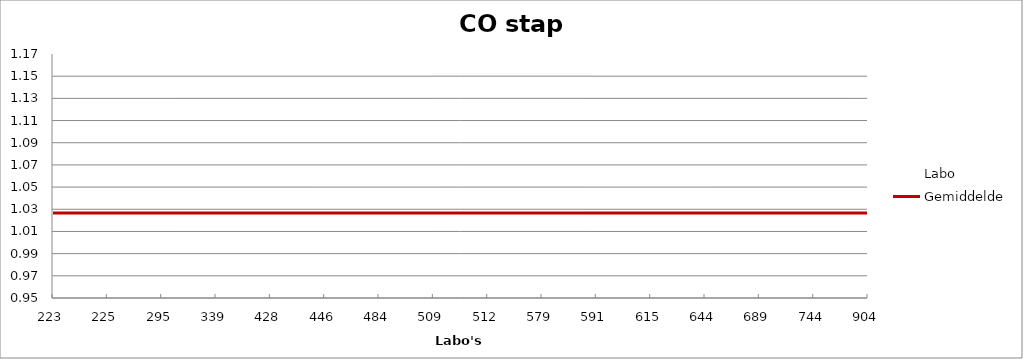
| Category | Labo | Gemiddelde |
|---|---|---|
| 223.0 | 1.004 | 1.027 |
| 225.0 | 0.973 | 1.027 |
| 295.0 | 0.98 | 1.027 |
| 339.0 | 1.051 | 1.027 |
| 428.0 | 0.98 | 1.027 |
| 446.0 | 1.021 | 1.027 |
| 484.0 | 1.136 | 1.027 |
| 509.0 | 1.007 | 1.027 |
| 512.0 | 0.994 | 1.027 |
| 579.0 | 1.054 | 1.027 |
| 591.0 | 0.956 | 1.027 |
| 615.0 | 1.159 | 1.027 |
| 644.0 | 1.149 | 1.027 |
| 689.0 | 0.967 | 1.027 |
| 744.0 | 1.068 | 1.027 |
| 904.0 | 0.994 | 1.027 |